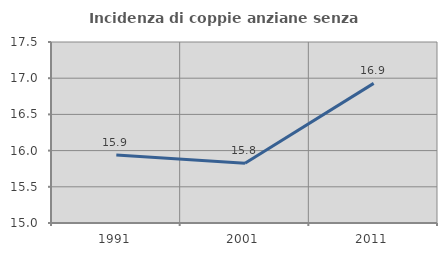
| Category | Incidenza di coppie anziane senza figli  |
|---|---|
| 1991.0 | 15.94 |
| 2001.0 | 15.825 |
| 2011.0 | 16.928 |